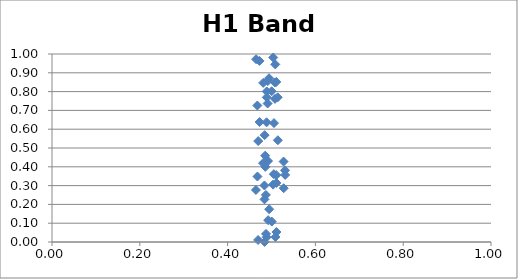
| Category | H1 Band 3 |
|---|---|
| 0.46455494882844073 | 0.277 |
| 0.46488365452004693 | 0.972 |
| 0.4677212901048254 | 0.726 |
| 0.468050766000257 | 0.348 |
| 0.46939531370324594 | 0.011 |
| 0.4697251901427278 | 0.537 |
| 0.47257282340901496 | 0.963 |
| 0.4729034474526771 | 0.638 |
| 0.4807351240729726 | 0.419 |
| 0.4810675922726531 | 0.846 |
| 0.48393734025601715 | 0.301 |
| 0.4839658054839773 | 0.227 |
| 0.4842705018974237 | 0 |
| 0.4842989732134586 | 0.568 |
| 0.48562999827323833 | 0.459 |
| 0.48596351960371315 | 0.4 |
| 0.48717468525276447 | 0.251 |
| 0.4875085306853144 | 0.043 |
| 0.4888422454966358 | 0.637 |
| 0.4888707987680166 | 0.025 |
| 0.48917643637018243 | 0.801 |
| 0.4892049955162899 | 0.769 |
| 0.4911523083885197 | 0.737 |
| 0.4914869701723146 | 0.856 |
| 0.49208947646009404 | 0.431 |
| 0.4924243267586829 | 0.116 |
| 0.4943754121435399 | 0.871 |
| 0.49471071613820533 | 0.175 |
| 0.5003529490451061 | 0.802 |
| 0.5006893982569119 | 0.109 |
| 0.5035930528669529 | 0.305 |
| 0.5039300978919382 | 0.981 |
| 0.5053053264256767 | 0.361 |
| 0.505642679215196 | 0.632 |
| 0.5076081978557668 | 0.849 |
| 0.5079459568089202 | 0.761 |
| 0.5085540156594502 | 0.945 |
| 0.5088919388489218 | 0.027 |
| 0.5108607441420949 | 0.852 |
| 0.5108896504730372 | 0.356 |
| 0.5111990615744799 | 0.314 |
| 0.5112279727889898 | 0.053 |
| 0.5141475441911506 | 0.77 |
| 0.5144864078873235 | 0.541 |
| 0.5275122695014923 | 0.428 |
| 0.527853166059375 | 0.286 |
| 0.5307945527084136 | 0.381 |
| 0.5311359020239407 | 0.357 |